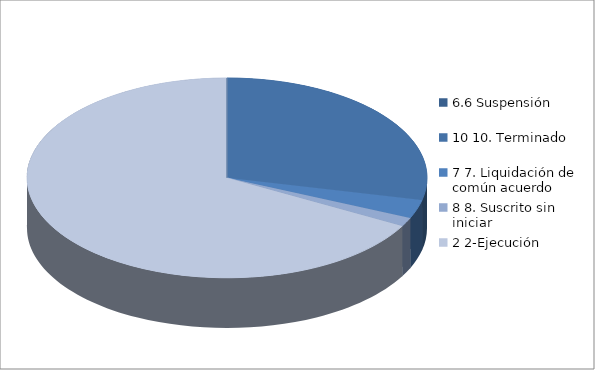
| Category | Series 0 |
|---|---|
| 6.6 Suspensión | 0 |
| 10 10. Terminado | 237 |
| 7 7. Liquidación de común acuerdo | 25 |
| 8 8. Suscrito sin iniciar | 12 |
| 2 2-Ejecución | 556 |